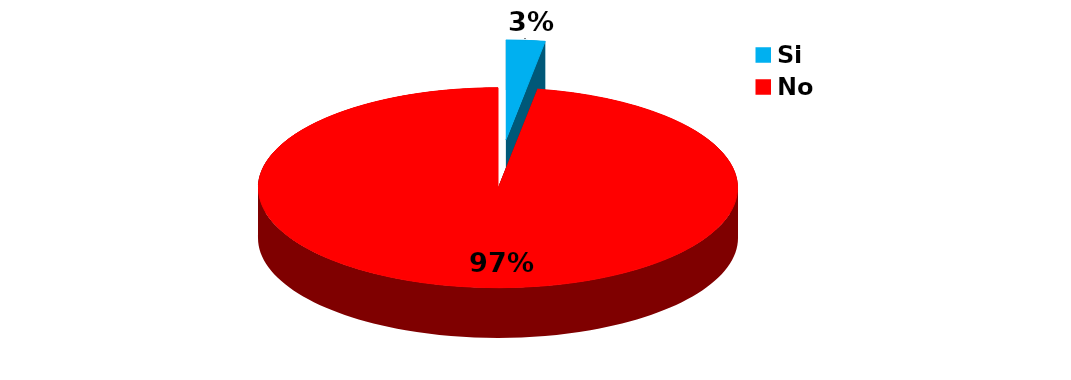
| Category | Series 0 |
|---|---|
| Si | 5 |
| No | 186 |